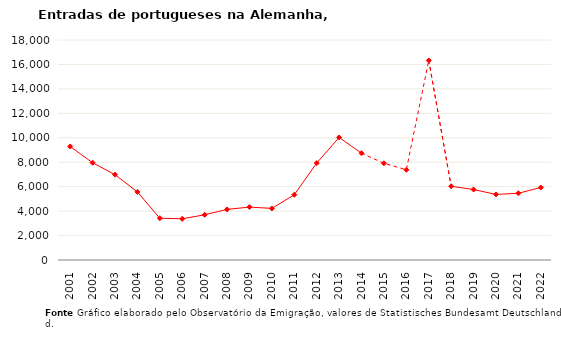
| Category | Entradas |
|---|---|
| 2001.0 | 9287 |
| 2002.0 | 7955 |
| 2003.0 | 6981 |
| 2004.0 | 5570 |
| 2005.0 | 3418 |
| 2006.0 | 3371 |
| 2007.0 | 3700 |
| 2008.0 | 4140 |
| 2009.0 | 4330 |
| 2010.0 | 4220 |
| 2011.0 | 5340 |
| 2012.0 | 7930 |
| 2013.0 | 10030 |
| 2014.0 | 8735 |
| 2015.0 | 7915 |
| 2016.0 | 7380 |
| 2017.0 | 16325 |
| 2018.0 | 6035 |
| 2019.0 | 5765 |
| 2020.0 | 5365 |
| 2021.0 | 5460 |
| 2022.0 | 5935 |